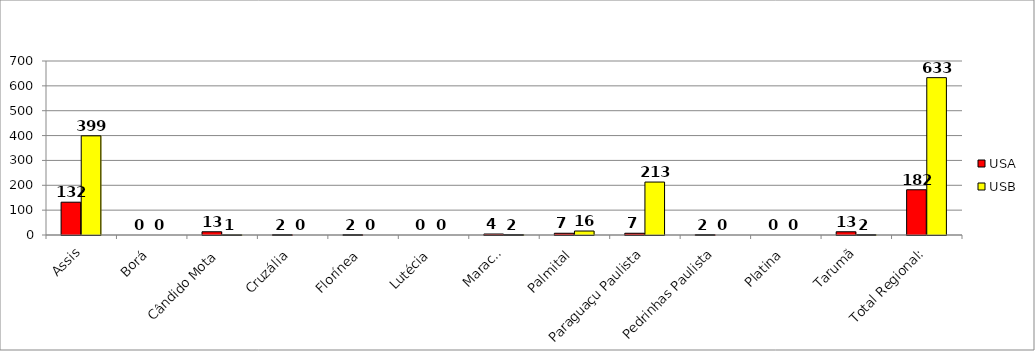
| Category | USA | USB |
|---|---|---|
| Assis | 132 | 399 |
| Borá | 0 | 0 |
| Cândido Mota | 13 | 1 |
| Cruzália | 2 | 0 |
| Florínea | 2 | 0 |
| Lutécia | 0 | 0 |
| Maracaí | 4 | 2 |
| Palmital | 7 | 16 |
| Paraguaçu Paulista | 7 | 213 |
| Pedrinhas Paulista | 2 | 0 |
| Platina | 0 | 0 |
| Tarumã | 13 | 2 |
| Total Regional: | 182 | 633 |